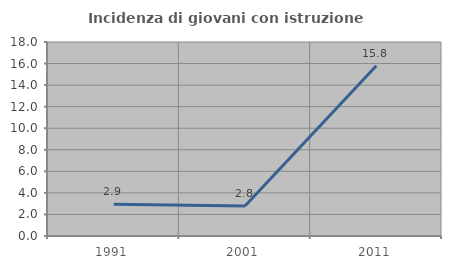
| Category | Incidenza di giovani con istruzione universitaria |
|---|---|
| 1991.0 | 2.941 |
| 2001.0 | 2.778 |
| 2011.0 | 15.789 |